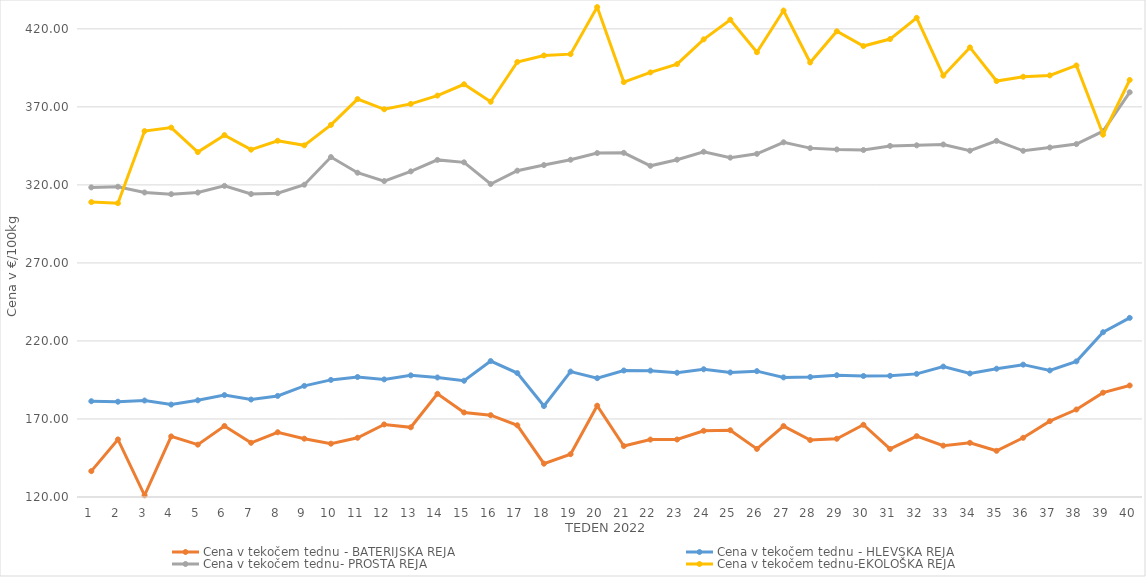
| Category | Cena v tekočem tednu - BATERIJSKA REJA | Cena v tekočem tednu - HLEVSKA REJA | Cena v tekočem tednu- PROSTA REJA | Cena v tekočem tednu-EKOLOŠKA REJA |
|---|---|---|---|---|
| 1.0 | 136.59 | 181.38 | 318.4 | 308.97 |
| 2.0 | 156.88 | 181.07 | 318.82 | 308.28 |
| 3.0 | 121.07 | 181.83 | 315.14 | 354.48 |
| 4.0 | 158.82 | 179.22 | 314.08 | 356.72 |
| 5.0 | 153.55 | 181.96 | 315.1 | 341.03 |
| 6.0 | 165.51 | 185.31 | 319.38 | 351.9 |
| 7.0 | 154.74 | 182.45 | 314.16 | 342.59 |
| 8.0 | 161.48 | 184.77 | 314.71 | 348.28 |
| 9.0 | 157.38 | 191.21 | 320.1 | 345.35 |
| 10.0 | 154.16 | 195.04 | 337.83 | 358.45 |
| 11.0 | 157.96 | 196.88 | 327.79 | 375 |
| 12.0 | 166.49 | 195.36 | 322.46 | 368.45 |
| 13.0 | 164.66 | 197.95 | 328.67 | 371.9 |
| 14.0 | 186.11 | 196.59 | 336.02 | 377.24 |
| 15.0 | 174.18 | 194.49 | 334.46 | 384.48 |
| 16.0 | 172.42 | 207.1 | 320.58 | 373.28 |
| 17.0 | 165.96 | 199.41 | 329.11 | 398.79 |
| 18.0 | 141.36 | 178.29 | 332.71 | 402.93 |
| 19.0 | 147.43 | 200.37 | 336.11 | 403.79 |
| 20.0 | 178.51 | 196.16 | 340.4 | 433.97 |
| 21.0 | 152.67 | 201.05 | 340.55 | 385.86 |
| 22.0 | 156.8 | 200.98 | 332.23 | 392.07 |
| 23.0 | 156.84 | 199.63 | 336.16 | 397.41 |
| 24.0 | 162.44 | 201.86 | 341.24 | 413.28 |
| 25.0 | 162.78 | 199.81 | 337.48 | 425.86 |
| 26.0 | 150.82 | 200.65 | 339.9 | 405 |
| 27.0 | 165.45 | 196.64 | 347.3 | 431.72 |
| 28.0 | 156.46 | 196.88 | 343.56 | 398.45 |
| 29.0 | 157.31 | 198.03 | 342.71 | 418.45 |
| 30.0 | 166.29 | 197.55 | 342.35 | 408.97 |
| 31.0 | 150.81 | 197.66 | 344.97 | 413.45 |
| 32.0 | 158.99 | 198.9 | 345.35 | 427.07 |
| 33.0 | 152.91 | 203.57 | 345.9 | 390 |
| 34.0 | 154.73 | 199.17 | 341.92 | 408.1 |
| 35.0 | 149.6 | 202.21 | 348.2 | 386.55 |
| 36.0 | 157.93 | 204.81 | 341.85 | 389.31 |
| 37.0 | 168.61 | 201.11 | 343.97 | 390.17 |
| 38.0 | 176.07 | 206.91 | 346.16 | 396.55 |
| 39.0 | 186.86 | 225.6 | 354.41 | 352.24 |
| 40.0 | 191.45 | 234.79 | 379.35 | 387.24 |